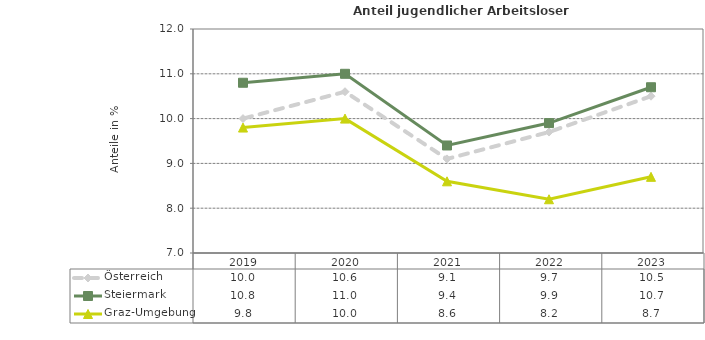
| Category | Österreich | Steiermark | Graz-Umgebung |
|---|---|---|---|
| 2023.0 | 10.5 | 10.7 | 8.7 |
| 2022.0 | 9.7 | 9.9 | 8.2 |
| 2021.0 | 9.1 | 9.4 | 8.6 |
| 2020.0 | 10.6 | 11 | 10 |
| 2019.0 | 10 | 10.8 | 9.8 |